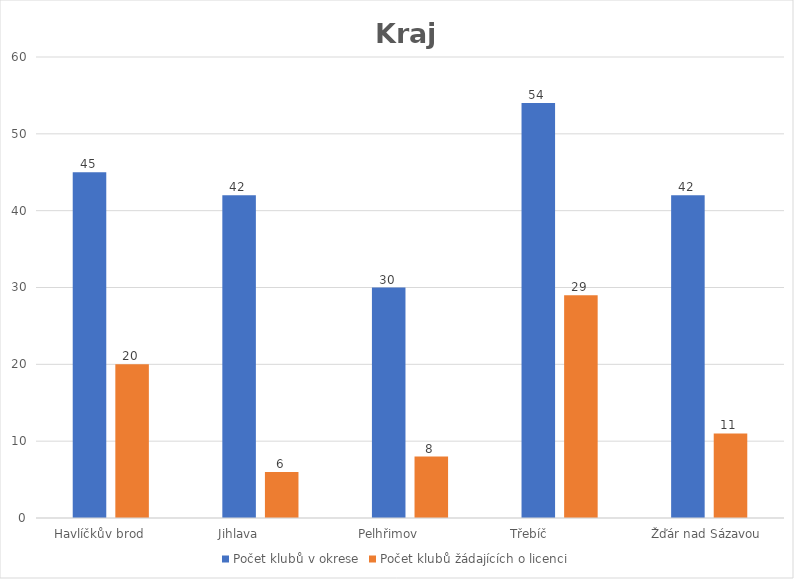
| Category | Počet klubů v okrese | Počet klubů žádajících o licenci |
|---|---|---|
| Havlíčkův brod      | 45 | 20 |
| Jihlava            | 42 | 6 |
| Pelhřimov            | 30 | 8 |
| Třebíč                | 54 | 29 |
| Žďár nad Sázavou  | 42 | 11 |